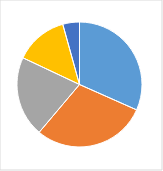
| Category | Series 0 |
|---|---|
| 0 | 0.319 |
| 1 | 0.297 |
| 2 | 0.21 |
| 3 | 0.138 |
| 4 | 0.043 |